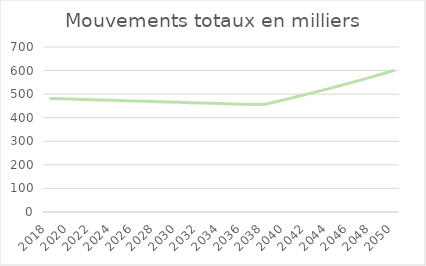
| Category | Mouvements totaux en milliers |
|---|---|
| 2018.0 | 482 |
| 2019.0 | 480.591 |
| 2020.0 | 479.185 |
| 2021.0 | 477.784 |
| 2022.0 | 476.387 |
| 2023.0 | 474.994 |
| 2024.0 | 473.605 |
| 2025.0 | 472.221 |
| 2026.0 | 470.84 |
| 2027.0 | 469.463 |
| 2028.0 | 468.09 |
| 2029.0 | 466.722 |
| 2030.0 | 465.357 |
| 2031.0 | 463.996 |
| 2032.0 | 462.64 |
| 2033.0 | 461.287 |
| 2034.0 | 459.938 |
| 2035.0 | 458.593 |
| 2036.0 | 457.252 |
| 2037.0 | 455.915 |
| 2038.0 | 457.564 |
| 2039.0 | 468.088 |
| 2040.0 | 478.854 |
| 2041.0 | 489.867 |
| 2042.0 | 501.134 |
| 2043.0 | 512.66 |
| 2044.0 | 524.452 |
| 2045.0 | 536.514 |
| 2046.0 | 548.854 |
| 2047.0 | 561.477 |
| 2048.0 | 574.391 |
| 2049.0 | 587.602 |
| 2050.0 | 601.117 |